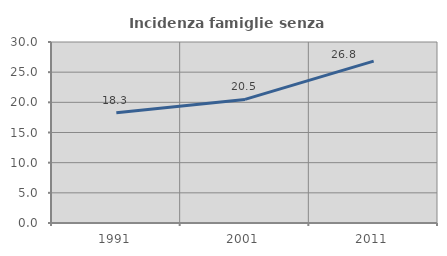
| Category | Incidenza famiglie senza nuclei |
|---|---|
| 1991.0 | 18.258 |
| 2001.0 | 20.482 |
| 2011.0 | 26.825 |